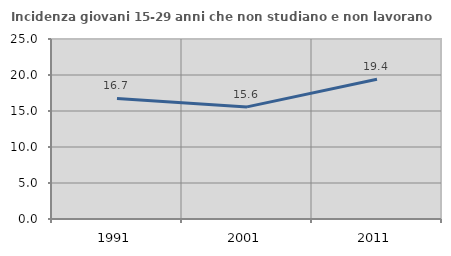
| Category | Incidenza giovani 15-29 anni che non studiano e non lavorano  |
|---|---|
| 1991.0 | 16.741 |
| 2001.0 | 15.572 |
| 2011.0 | 19.415 |